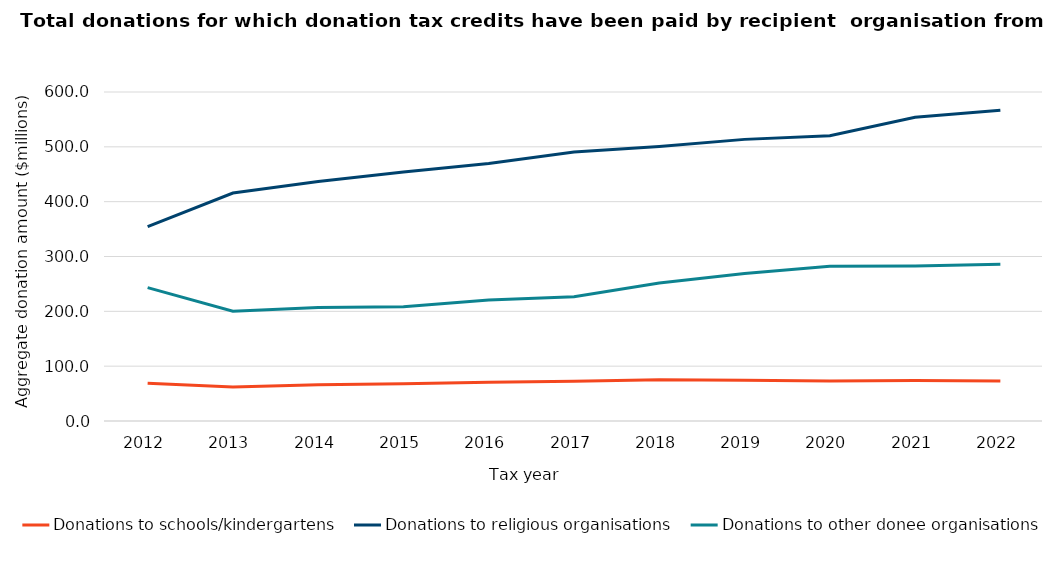
| Category | Donations to schools/kindergartens | Donations to religious organisations | Donations to other donee organisations |
|---|---|---|---|
| 2012.0 | 68.7 | 354.6 | 243.3 |
| 2013.0 | 62.1 | 415.8 | 200.1 |
| 2014.0 | 66 | 436.8 | 207 |
| 2015.0 | 68.1 | 454.2 | 208.5 |
| 2016.0 | 70.5 | 469.8 | 220.5 |
| 2017.0 | 72.3 | 490.5 | 226.5 |
| 2018.0 | 75.3 | 500.7 | 251.7 |
| 2019.0 | 74.1 | 513.6 | 268.8 |
| 2020.0 | 73.1 | 520.2 | 282.1 |
| 2021.0 | 73.8 | 553.8 | 282.7 |
| 2022.0 | 72.9 | 566.8 | 286 |